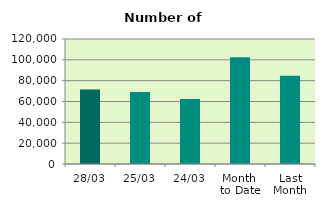
| Category | Series 0 |
|---|---|
| 28/03 | 71516 |
| 25/03 | 69150 |
| 24/03 | 62290 |
| Month 
to Date | 102580.5 |
| Last
Month | 84726.4 |